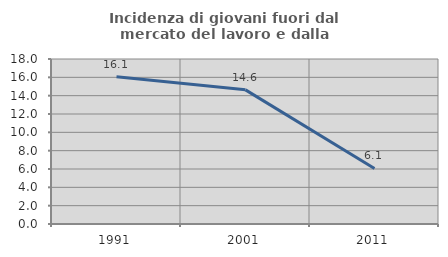
| Category | Incidenza di giovani fuori dal mercato del lavoro e dalla formazione  |
|---|---|
| 1991.0 | 16.071 |
| 2001.0 | 14.634 |
| 2011.0 | 6.061 |